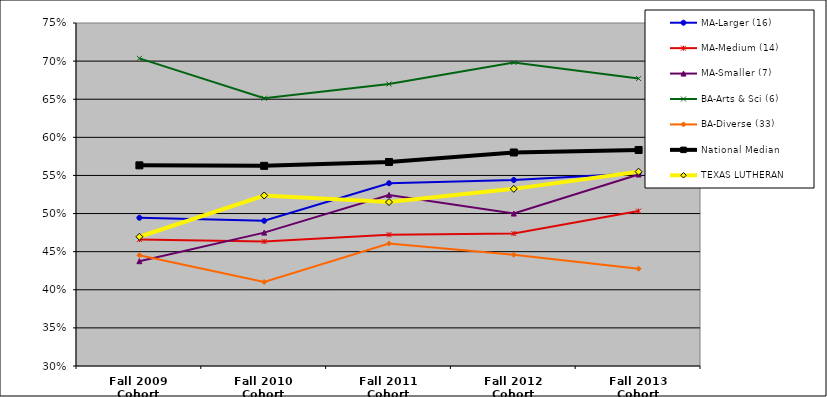
| Category | MA-Larger (16) | MA-Medium (14) | MA-Smaller (7) | BA-Arts & Sci (6) | BA-Diverse (33) | National Median | TEXAS LUTHERAN |
|---|---|---|---|---|---|---|---|
| Fall 2009 Cohort | 0.494 | 0.466 | 0.438 | 0.704 | 0.445 | 0.563 | 0.47 |
| Fall 2010 Cohort | 0.49 | 0.463 | 0.475 | 0.651 | 0.41 | 0.563 | 0.524 |
| Fall 2011 Cohort | 0.54 | 0.472 | 0.524 | 0.67 | 0.461 | 0.568 | 0.515 |
| Fall 2012 Cohort | 0.544 | 0.474 | 0.5 | 0.698 | 0.446 | 0.58 | 0.532 |
| Fall 2013 Cohort | 0.553 | 0.503 | 0.551 | 0.677 | 0.428 | 0.583 | 0.555 |